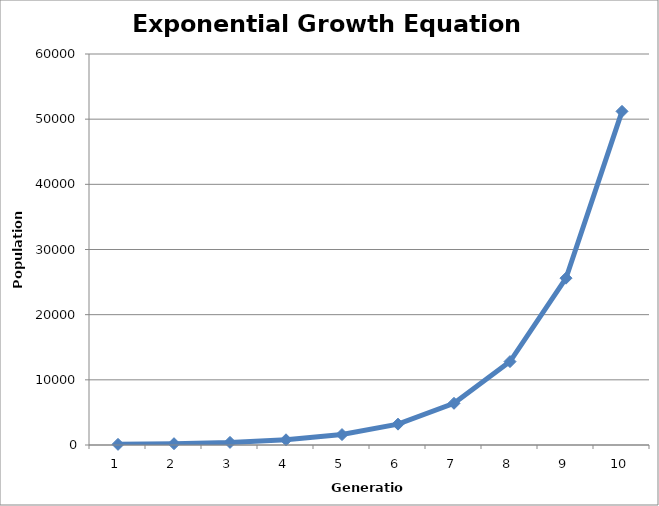
| Category | Generation |
|---|---|
| 1.0 | 100 |
| 2.0 | 200 |
| 3.0 | 400 |
| 4.0 | 800 |
| 5.0 | 1600 |
| 6.0 | 3200 |
| 7.0 | 6400 |
| 8.0 | 12800 |
| 9.0 | 25600 |
| 10.0 | 51200 |